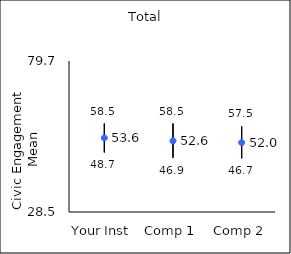
| Category | 25th percentile | 75th percentile | Mean |
|---|---|---|---|
| Your Inst | 48.7 | 58.5 | 53.62 |
| Comp 1 | 46.9 | 58.5 | 52.63 |
| Comp 2 | 46.7 | 57.5 | 52.04 |